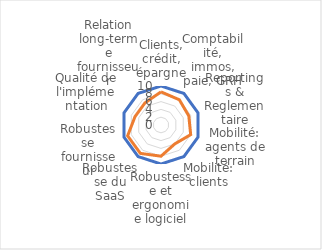
| Category | Ideal | Fournisseur #3 |
|---|---|---|
| Clients, crédit, épargne | 10 | 8.5 |
| Comptabilité, immos, paie, GRH | 10 | 8 |
| Reportings & Reglementaire | 10 | 7.5 |
| Mobilité: agents de terrain | 10 | 8 |
| Mobilité: clients | 10 | 6 |
| Robustesse et ergonomie logiciel | 10 | 8 |
| Robustesse du SaaS | 10 | 9 |
| Robustesse fournisseur | 10 | 9 |
| Qualité de l'implémentation | 10 | 7 |
| Relation long-terme fournisseur | 10 | 7 |